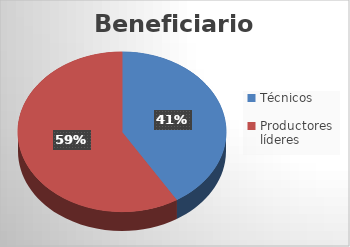
| Category | Series 0 |
|---|---|
| Técnicos | 187 |
| Productores líderes | 267 |